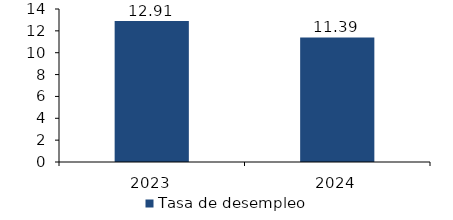
| Category | Tasa de desempleo |
|---|---|
| 2023.0 | 12.91 |
| 2024.0 | 11.395 |